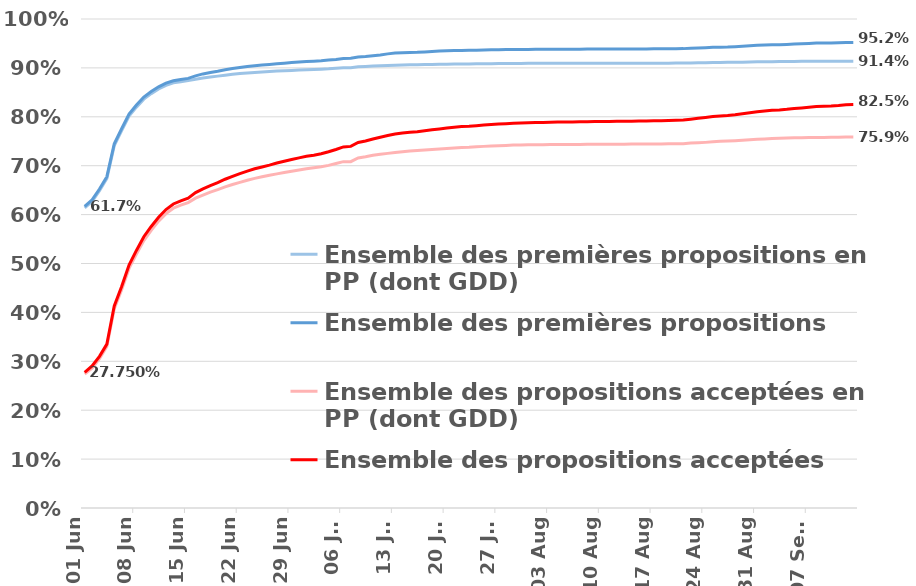
| Category | Ensemble des premières propositions en PP (dont GDD) | Ensemble des premières propositions | Ensemble des propositions acceptées en PP (dont GDD) | Ensemble des propositions acceptées |
|---|---|---|---|---|
| 2023-06-01 | 0.614 | 0.617 | 0.274 | 0.277 |
| 2023-06-02 | 0.627 | 0.63 | 0.286 | 0.291 |
| 2023-06-03 | 0.649 | 0.652 | 0.305 | 0.31 |
| 2023-06-04 | 0.674 | 0.678 | 0.33 | 0.335 |
| 2023-06-05 | 0.741 | 0.745 | 0.407 | 0.413 |
| 2023-06-06 | 0.772 | 0.776 | 0.447 | 0.453 |
| 2023-06-07 | 0.801 | 0.806 | 0.49 | 0.497 |
| 2023-06-08 | 0.82 | 0.824 | 0.519 | 0.527 |
| 2023-06-09 | 0.836 | 0.84 | 0.547 | 0.555 |
| 2023-06-10 | 0.847 | 0.852 | 0.568 | 0.576 |
| 2023-06-11 | 0.857 | 0.861 | 0.587 | 0.594 |
| 2023-06-12 | 0.864 | 0.869 | 0.602 | 0.61 |
| 2023-06-13 | 0.869 | 0.874 | 0.613 | 0.622 |
| 2023-06-14 | 0.872 | 0.876 | 0.619 | 0.628 |
| 2023-06-15 | 0.874 | 0.879 | 0.625 | 0.634 |
| 2023-06-16 | 0.877 | 0.884 | 0.634 | 0.645 |
| 2023-06-17 | 0.879 | 0.888 | 0.64 | 0.653 |
| 2023-06-18 | 0.881 | 0.891 | 0.646 | 0.659 |
| 2023-06-19 | 0.883 | 0.893 | 0.651 | 0.665 |
| 2023-06-20 | 0.885 | 0.896 | 0.657 | 0.672 |
| 2023-06-21 | 0.887 | 0.899 | 0.662 | 0.678 |
| 2023-06-22 | 0.888 | 0.901 | 0.666 | 0.684 |
| 2023-06-23 | 0.89 | 0.903 | 0.67 | 0.689 |
| 2023-06-24 | 0.891 | 0.905 | 0.674 | 0.694 |
| 2023-06-25 | 0.892 | 0.906 | 0.677 | 0.697 |
| 2023-06-26 | 0.893 | 0.907 | 0.68 | 0.701 |
| 2023-06-27 | 0.893 | 0.908 | 0.683 | 0.705 |
| 2023-06-28 | 0.894 | 0.91 | 0.686 | 0.709 |
| 2023-06-29 | 0.895 | 0.911 | 0.689 | 0.713 |
| 2023-06-30 | 0.896 | 0.912 | 0.691 | 0.716 |
| 2023-07-01 | 0.896 | 0.913 | 0.694 | 0.719 |
| 2023-07-02 | 0.897 | 0.914 | 0.696 | 0.721 |
| 2023-07-03 | 0.897 | 0.915 | 0.698 | 0.724 |
| 2023-07-04 | 0.898 | 0.916 | 0.701 | 0.729 |
| 2023-07-05 | 0.899 | 0.917 | 0.704 | 0.733 |
| 2023-07-06 | 0.9 | 0.919 | 0.708 | 0.738 |
| 2023-07-07 | 0.9 | 0.92 | 0.708 | 0.74 |
| 2023-07-08 | 0.902 | 0.922 | 0.716 | 0.748 |
| 2023-07-09 | 0.903 | 0.923 | 0.718 | 0.75 |
| 2023-07-10 | 0.904 | 0.925 | 0.721 | 0.755 |
| 2023-07-11 | 0.904 | 0.926 | 0.723 | 0.758 |
| 2023-07-12 | 0.905 | 0.929 | 0.725 | 0.762 |
| 2023-07-13 | 0.906 | 0.93 | 0.727 | 0.765 |
| 2023-07-14 | 0.906 | 0.931 | 0.729 | 0.767 |
| 2023-07-15 | 0.906 | 0.931 | 0.73 | 0.768 |
| 2023-07-16 | 0.907 | 0.932 | 0.731 | 0.77 |
| 2023-07-17 | 0.907 | 0.933 | 0.732 | 0.771 |
| 2023-07-18 | 0.907 | 0.934 | 0.733 | 0.773 |
| 2023-07-19 | 0.907 | 0.934 | 0.734 | 0.775 |
| 2023-07-20 | 0.908 | 0.935 | 0.735 | 0.777 |
| 2023-07-21 | 0.908 | 0.936 | 0.736 | 0.779 |
| 2023-07-22 | 0.908 | 0.936 | 0.737 | 0.78 |
| 2023-07-23 | 0.908 | 0.936 | 0.738 | 0.781 |
| 2023-07-24 | 0.908 | 0.936 | 0.739 | 0.782 |
| 2023-07-25 | 0.909 | 0.937 | 0.74 | 0.783 |
| 2023-07-26 | 0.909 | 0.937 | 0.74 | 0.784 |
| 2023-07-27 | 0.909 | 0.937 | 0.741 | 0.785 |
| 2023-07-28 | 0.909 | 0.937 | 0.742 | 0.786 |
| 2023-07-29 | 0.909 | 0.938 | 0.742 | 0.787 |
| 2023-07-30 | 0.909 | 0.938 | 0.743 | 0.787 |
| 2023-07-31 | 0.909 | 0.938 | 0.743 | 0.788 |
| 2023-08-01 | 0.909 | 0.938 | 0.743 | 0.788 |
| 2023-08-02 | 0.909 | 0.938 | 0.743 | 0.789 |
| 2023-08-03 | 0.909 | 0.938 | 0.743 | 0.789 |
| 2023-08-04 | 0.909 | 0.938 | 0.743 | 0.789 |
| 2023-08-05 | 0.909 | 0.938 | 0.743 | 0.789 |
| 2023-08-06 | 0.909 | 0.938 | 0.743 | 0.789 |
| 2023-08-07 | 0.909 | 0.938 | 0.744 | 0.79 |
| 2023-08-08 | 0.909 | 0.938 | 0.744 | 0.79 |
| 2023-08-09 | 0.91 | 0.939 | 0.744 | 0.79 |
| 2023-08-10 | 0.91 | 0.939 | 0.744 | 0.79 |
| 2023-08-11 | 0.91 | 0.939 | 0.744 | 0.791 |
| 2023-08-12 | 0.91 | 0.939 | 0.744 | 0.791 |
| 2023-08-13 | 0.91 | 0.939 | 0.744 | 0.791 |
| 2023-08-14 | 0.91 | 0.939 | 0.744 | 0.791 |
| 2023-08-15 | 0.91 | 0.939 | 0.744 | 0.791 |
| 2023-08-16 | 0.91 | 0.939 | 0.744 | 0.791 |
| 2023-08-17 | 0.91 | 0.939 | 0.744 | 0.792 |
| 2023-08-18 | 0.91 | 0.939 | 0.745 | 0.792 |
| 2023-08-19 | 0.91 | 0.939 | 0.745 | 0.793 |
| 2023-08-20 | 0.91 | 0.939 | 0.745 | 0.793 |
| 2023-08-21 | 0.91 | 0.939 | 0.745 | 0.793 |
| 2023-08-22 | 0.91 | 0.94 | 0.746 | 0.795 |
| 2023-08-23 | 0.91 | 0.94 | 0.747 | 0.797 |
| 2023-08-24 | 0.911 | 0.941 | 0.748 | 0.799 |
| 2023-08-25 | 0.911 | 0.942 | 0.749 | 0.8 |
| 2023-08-26 | 0.911 | 0.942 | 0.75 | 0.802 |
| 2023-08-27 | 0.911 | 0.943 | 0.751 | 0.803 |
| 2023-08-28 | 0.912 | 0.943 | 0.751 | 0.804 |
| 2023-08-29 | 0.912 | 0.944 | 0.752 | 0.806 |
| 2023-08-30 | 0.912 | 0.945 | 0.753 | 0.808 |
| 2023-08-31 | 0.912 | 0.946 | 0.754 | 0.81 |
| 2023-09-01 | 0.913 | 0.947 | 0.755 | 0.812 |
| 2023-09-02 | 0.913 | 0.947 | 0.756 | 0.813 |
| 2023-09-03 | 0.913 | 0.947 | 0.756 | 0.814 |
| 2023-09-04 | 0.913 | 0.948 | 0.757 | 0.815 |
| 2023-09-05 | 0.913 | 0.949 | 0.757 | 0.817 |
| 2023-09-06 | 0.913 | 0.949 | 0.757 | 0.818 |
| 2023-09-07 | 0.913 | 0.95 | 0.758 | 0.82 |
| 2023-09-08 | 0.914 | 0.951 | 0.758 | 0.821 |
| 2023-09-09 | 0.914 | 0.951 | 0.758 | 0.822 |
| 2023-09-10 | 0.914 | 0.951 | 0.758 | 0.822 |
| 2023-09-11 | 0.914 | 0.951 | 0.758 | 0.823 |
| 2023-09-12 | 0.914 | 0.952 | 0.758 | 0.825 |
| 2023-09-13 | 0.914 | 0.952 | 0.759 | 0.825 |